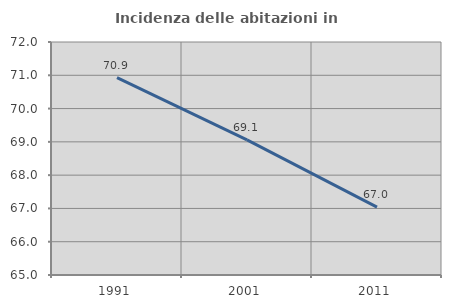
| Category | Incidenza delle abitazioni in proprietà  |
|---|---|
| 1991.0 | 70.93 |
| 2001.0 | 69.059 |
| 2011.0 | 67.038 |